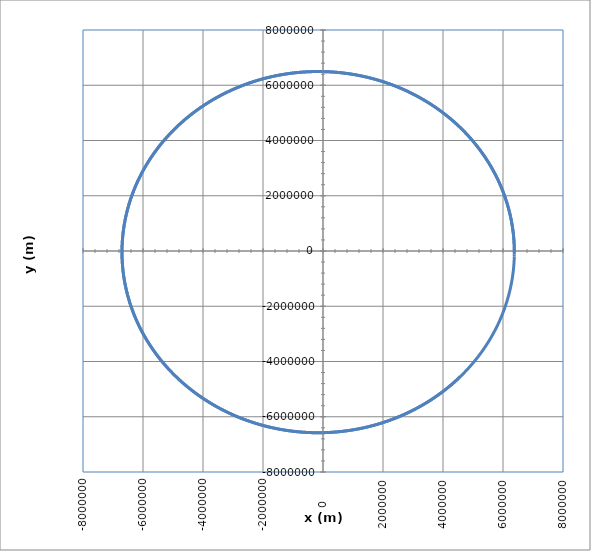
| Category | Series 0 |
|---|---|
| 6378000.0 | 0 |
| 6377020.689898966 | 80000 |
| 6375062.000099734 | 159987.714 |
| 6372124.0226277085 | 239950.851 |
| 6368207.011246662 | 319877.122 |
| 6363311.381537034 | 399754.236 |
| 6357437.710936596 | 479569.909 |
| 6350586.738743401 | 559311.859 |
| 6342759.366080954 | 638967.814 |
| 6333956.655825519 | 718525.515 |
| 6324179.832495554 | 797972.712 |
| 6313430.282103225 | 877297.173 |
| 6301709.551967995 | 956486.68 |
| 6289019.350492314 | 1035529.04 |
| 6275361.546899408 | 1114412.077 |
| 6260738.1709332345 | 1193123.643 |
| 6245151.41252065 | 1271651.615 |
| 6228603.621395869 | 1349983.899 |
| 6211097.306687311 | 1428108.433 |
| 6192635.136466936 | 1506013.189 |
| 6173219.937262207 | 1583686.173 |
| 6152854.693530814 | 1661115.432 |
| 6131542.547098321 | 1738289.052 |
| 6109286.796558916 | 1815195.159 |
| 6086090.896639446 | 1891821.929 |
| 6061958.45752696 | 1968157.582 |
| 6036893.244159976 | 2044190.388 |
| 6010899.175483707 | 2119908.669 |
| 5983980.323669521 | 2195300.799 |
| 5956140.913298884 | 2270355.21 |
| 5927385.320512096 | 2345060.392 |
| 5897718.072122102 | 2419404.894 |
| 5867143.844693707 | 2493377.329 |
| 5835667.463588539 | 2566966.372 |
| 5803293.90197607 | 2640160.768 |
| 5770028.279811107 | 2712949.329 |
| 5735875.862778079 | 2785320.937 |
| 5700842.061202551 | 2857264.547 |
| 5664932.428930338 | 2928769.191 |
| 5628152.662174647 | 2999823.975 |
| 5590508.598331685 | 3070418.086 |
| 5552006.214765155 | 3140540.791 |
| 5512651.627560107 | 3210181.44 |
| 5472451.090246614 | 3279329.467 |
| 5431410.992493735 | 3347974.392 |
| 5389537.858774267 | 3416105.826 |
| 5346838.347000788 | 3483713.469 |
| 5303319.247133486 | 3550787.112 |
| 5258987.479760316 | 3617316.641 |
| 5213850.094649998 | 3683292.038 |
| 5167914.269278402 | 3748703.381 |
| 5121187.307328886 | 3813540.85 |
| 5073676.637167109 | 3877794.723 |
| 5025389.810290927 | 3941455.382 |
| 4976334.499755917 | 4004513.312 |
| 4926518.498577127 | 4066959.107 |
| 4875949.718107632 | 4128783.464 |
| 4824636.186394505 | 4189977.191 |
| 4772586.046512788 | 4250531.208 |
| 4719807.554878091 | 4310436.545 |
| 4666309.07953842 | 4369684.345 |
| 4612099.098445855 | 4428265.869 |
| 4557186.197708716 | 4486172.49 |
| 4501579.069824819 | 4543395.702 |
| 4445286.511896488 | 4599927.117 |
| 4388317.423827927 | 4655758.467 |
| 4330680.806505612 | 4710881.606 |
| 4272385.759962345 | 4765288.511 |
| 4213441.481525593 | 4818971.282 |
| 4153857.263950793 | 4871922.146 |
| 4093642.4935402297 | 4924133.455 |
| 4032806.6482481724 | 4975597.69 |
| 3971359.295772895 | 5026307.459 |
| 3909310.0916362423 | 5076255.502 |
| 3846668.7772513814 | 5125434.686 |
| 3783445.1779794004 | 5173838.015 |
| 3719649.201175389 | 5221458.62 |
| 3655290.8342246576 | 5268289.77 |
| 3590380.142569737 | 5314324.867 |
| 3524927.2677287995 | 5359557.448 |
| 3458942.425306147 | 5403981.186 |
| 3392435.9029954006 | 5447589.892 |
| 3325418.0585760283 | 5490377.515 |
| 3257899.3179038437 | 5532338.141 |
| 3189890.1728961007 | 5573465.997 |
| 3121401.179511812 | 5613755.448 |
| 3052442.955727908 | 5653201.001 |
| 2983026.179511851 | 5691797.304 |
| 2913161.5867913202 | 5729539.145 |
| 2842859.96942156 | 5766421.455 |
| 2772132.173151005 | 5802439.31 |
| 2700989.0955857662 | 5837587.927 |
| 2629441.684153564 | 5871862.665 |
| 2557500.934067695 | 5905259.031 |
| 2485177.886291604 | 5937772.672 |
| 2412483.6255046246 | 5969399.384 |
| 2339429.2780694524 | 6000135.105 |
| 2266026.0100019025 | 6029975.919 |
| 2192285.0249434942 | 6058918.057 |
| 2118217.5621374035 | 6086957.892 |
| 2043834.8944083082 | 6114091.948 |
| 1969148.326146649 | 6140316.892 |
| 1894169.1912978187 | 6165629.536 |
| 1818908.8513567834 | 6190026.842 |
| 1743378.6933686293 | 6213505.916 |
| 1667590.1279355234 | 6236064.01 |
| 1591554.5872305636 | 6257698.523 |
| 1515283.5230189874 | 6278407.002 |
| 1438788.4046871967 | 6298187.137 |
| 1362080.7172800484 | 6317036.768 |
| 1285171.9595468515 | 6334953.877 |
| 1208073.641996498 | 6351936.596 |
| 1130797.2849621517 | 6367983.201 |
| 1053354.4166759017 | 6383092.112 |
| 975756.5713537835 | 6397261.897 |
| 898015.2872915571 | 6410491.268 |
| 820142.1049716235 | 6422779.082 |
| 742148.5651814499 | 6434124.34 |
| 664046.2071438631 | 6444526.189 |
| 585846.566659563 | 6453983.918 |
| 507561.17426219425 | 6462496.96 |
| 429201.5533863079 | 6470064.892 |
| 350779.2185485314 | 6476687.432 |
| 272305.6735422566 | 6482364.443 |
| 193792.40964614574 | 6487095.926 |
| 115250.90384674368 | 6490882.028 |
| 36692.61707547557 | 6493723.032 |
| -41871.00753970102 | 6495619.364 |
| -120428.5464077312 | 6496571.589 |
| -198968.59719273623 | 6496580.413 |
| -277479.78051688685 | 6495646.676 |
| -355950.7416476479 | 6493771.361 |
| -434370.15216917556 | 6490955.584 |
| -512726.71163765766 | 6487200.6 |
| -591009.1492203993 | 6482507.8 |
| -669206.2253184629 | 6476878.709 |
| -747306.733172684 | 6470314.987 |
| -825299.5004528912 | 6462818.428 |
| -903173.3908301715 | 6454390.959 |
| -980917.3055320269 | 6445034.638 |
| -1058520.1848802818 | 6434751.657 |
| -1135971.0098116074 | 6423544.335 |
| -1213258.8033805394 | 6411415.125 |
| -1290372.6322448726 | 6398366.605 |
| -1367301.6081333274 | 6384401.485 |
| -1444034.889295389 | 6369522.598 |
| -1520561.6819332307 | 6353732.907 |
| -1596871.2416156414 | 6337035.498 |
| -1672952.8746738818 | 6319433.584 |
| -1748795.9395794086 | 6300930.499 |
| -1824389.8483034074 | 6281529.702 |
| -1899724.0676580863 | 6261234.773 |
| -1974788.1206196903 | 6240049.411 |
| -2049571.5876332023 | 6217977.438 |
| -2124064.1078987056 | 6195022.792 |
| -2198255.380639388 | 6171189.531 |
| -2272135.166351177 | 6146481.829 |
| -2345693.2880340014 | 6120903.975 |
| -2418919.6324046827 | 6094460.373 |
| -2491804.151091463 | 6067155.544 |
| -2564336.861810187 | 6038994.116 |
| -2636507.849522158 | 6009980.834 |
| -2708307.2675737 | 5980120.549 |
| -2779725.338817453 | 5949418.226 |
| -2850752.356715451 | 5917878.936 |
| -2921378.6864240183 | 5885507.856 |
| -2991594.765860543 | 5852310.273 |
| -3061391.1067521814 | 5818291.575 |
| -3130758.2956665554 | 5783457.258 |
| -3199686.9950245107 | 5747812.918 |
| -3268167.944095006 | 5711364.254 |
| -3336191.959972214 | 5674117.066 |
| -3403749.938534908 | 5636077.252 |
| -3470832.8553882316 | 5597250.81 |
| -3537431.766787929 | 5557643.835 |
| -3603537.8105471395 | 5517262.518 |
| -3669142.206925849 | 5476113.145 |
| -3734236.2595031047 | 5434202.095 |
| -3798811.3560320963 | 5391535.84 |
| -3862858.9692782112 | 5348120.945 |
| -3926370.657840184 | 5303964.063 |
| -3989338.066954446 | 5259071.937 |
| -4051752.929282801 | 5213451.399 |
| -4113607.06568355 | 5167109.366 |
| -4174892.3859661804 | 5120052.843 |
| -4235600.88962976 | 5072288.916 |
| -4295724.666585158 | 5023824.758 |
| -4355255.897861221 | 4974667.621 |
| -4414186.856295056 | 4924824.839 |
| -4472509.907206532 | 4874303.826 |
| -4530217.509057162 | 4823112.075 |
| -4587302.214093492 | 4771257.154 |
| -4643756.668975144 | 4718746.71 |
| -4699573.615387652 | 4665588.462 |
| -4754745.890640251 | 4611790.205 |
| -4809266.428248741 | 4557359.805 |
| -4863128.258503592 | 4502305.201 |
| -4916324.509023441 | 4446634.4 |
| -4968848.405294114 | 4390355.48 |
| -5020693.271193335 | 4333476.584 |
| -5071852.529501274 | 4276005.925 |
| -5122319.702397084 | 4217951.779 |
| -5172088.41194157 | 4159322.486 |
| -5221152.380546165 | 4100126.45 |
| -5269505.431428335 | 4040372.136 |
| -5317141.4890536005 | 3980068.071 |
| -5364054.579564298 | 3919222.839 |
| -5410238.831195249 | 3857845.084 |
| -5455688.474676497 | 3795943.507 |
| -5500397.843623243 | 3733526.864 |
| -5544361.374913153 | 3670603.965 |
| -5587573.609051181 | 3607183.676 |
| -5630029.190522058 | 3543274.913 |
| -5671722.868130601 | 3478886.643 |
| -5712649.495329991 | 3414027.884 |
| -5752804.030538173 | 3348707.704 |
| -5792181.537442518 | 3282935.215 |
| -5830777.185292906 | 3216719.578 |
| -5868586.24918337 | 3150069.999 |
| -5905604.110322446 | 3082995.728 |
| -5941826.256292382 | 3015506.057 |
| -5977248.28129734 | 2947610.321 |
| -6011865.886400737 | 2879317.894 |
| -6045674.879751866 | 2810638.191 |
| -6078671.1768019395 | 2741580.666 |
| -6110850.800509688 | 2672154.807 |
| -6142209.881536653 | 2602370.141 |
| -6172744.658432309 | 2532236.229 |
| -6202451.477809145 | 2461762.665 |
| -6231326.794507852 | 2390959.077 |
| -6259367.171752716 | 2319835.122 |
| -6286569.281297379 | 2248400.49 |
| -6312929.903561067 | 2176664.898 |
| -6338445.927755425 | 2104638.094 |
| -6363114.35200208 | 2032329.85 |
| -6386932.283441042 | 1959749.966 |
| -6409896.938330071 | 1886908.263 |
| -6432005.642135129 | 1813814.592 |
| -6453255.829612016 | 1740478.819 |
| -6473645.044879315 | 1666910.838 |
| -6493170.941482761 | 1593120.56 |
| -6511831.282451117 | 1519117.914 |
| -6529623.940343695 | 1444912.851 |
| -6546546.897289591 | 1370515.335 |
| -6562598.245018769 | 1295935.348 |
| -6577776.184885062 | 1221182.886 |
| -6592079.027881204 | 1146267.961 |
| -6605505.194645981 | 1071200.594 |
| -6618053.215463596 | 995990.82 |
| -6629721.730255326 | 920648.684 |
| -6640509.488563569 | 845184.24 |
| -6650415.349528362 | 769607.551 |
| -6659438.281856442 | 693928.686 |
| -6667577.363782943 | 618157.722 |
| -6674831.783025795 | 542304.74 |
| -6681200.836732897 | 466379.826 |
| -6686683.931422147 | 390393.067 |
| -6691280.582914383 | 314354.555 |
| -6694990.416259309 | 238274.38 |
| -6697813.1656544665 | 162162.634 |
| -6699748.674357313 | 86029.406 |
| -6700796.8945904635 | 9884.785 |
| -6700957.887440153 | -66261.144 |
| -6700231.822747969 | -142398.302 |
| -6698618.978995902 | -218516.614 |
| -6696119.743184774 | -294606.01 |
| -6692734.610706069 | -370656.431 |
| -6688464.185207223 | -446657.821 |
| -6683309.17845041 | -522600.14 |
| -6677270.4101648545 | -598473.352 |
| -6670348.807892705 | -674267.438 |
| -6662545.40682851 | -749972.388 |
| -6653861.349652306 | -825578.206 |
| -6644297.886356369 | -901074.912 |
| -6633856.374065619 | -976452.54 |
| -6622538.276851736 | -1051701.142 |
| -6610345.165540966 | -1126810.785 |
| -6597278.717515669 | -1201771.559 |
| -6583340.716509589 | -1276573.568 |
| -6568533.052396882 | -1351206.942 |
| -6552857.7209748905 | -1425661.829 |
| -6536316.823740676 | -1499928.4 |
| -6518912.567661315 | -1573996.851 |
| -6500647.264937952 | -1647857.401 |
| -6481523.332763607 | -1721500.297 |
| -6461543.293074732 | -1794915.809 |
| -6440709.772296511 | -1868094.237 |
| -6419025.501081887 | -1941025.91 |
| -6396493.314044308 | -2013701.185 |
| -6373116.1494841715 | -2086110.449 |
| -6348897.0491089495 | -2158244.123 |
| -6323839.157746975 | -2230092.658 |
| -6297945.723054868 | -2301646.54 |
| -6271220.095218564 | -2372896.289 |
| -6243665.726647936 | -2443832.46 |
| -6215286.171664957 | -2514445.645 |
| -6186085.086185391 | -2584726.473 |
| -6156066.227393958 | -2654665.612 |
| -6125233.453412949 | -2724253.767 |
| -6093590.722964244 | -2793481.687 |
| -6061142.095024691 | -2862340.16 |
| -6027891.728474805 | -2930820.017 |
| -5993843.881740736 | -2998912.131 |
| -5959002.912429457 | -3066607.42 |
| -5923373.276957124 | -3133896.847 |
| -5886959.530170553 | -3200771.423 |
| -5849766.324961759 | -3267222.203 |
| -5811798.41187549 | -3333240.291 |
| -5773060.638709717 | -3398816.842 |
| -5733557.950109001 | -3463943.059 |
| -5693295.387150675 | -3528610.195 |
| -5652278.0869237855 | -3592809.558 |
| -5610511.282100715 | -3656532.506 |
| -5568000.300501423 | -3719770.453 |
| -5524750.564650235 | -3782514.866 |
| -5480767.591325098 | -3844757.269 |
| -5436056.991099238 | -3906489.241 |
| -5390624.467875143 | -3967702.422 |
| -5344475.818410779 | -4028388.506 |
| -5297616.931837986 | -4088539.251 |
| -5250053.789172942 | -4148146.472 |
| -5201792.4628186375 | -4207202.048 |
| -5152839.116059268 | -4265697.918 |
| -5103200.002546451 | -4323626.088 |
| -5052881.465777196 | -4380978.624 |
| -5001889.938563524 | -4437747.659 |
| -4950231.942493663 | -4493925.395 |
| -4897914.087384716 | -4549504.096 |
| -4844943.070726712 | -4604476.098 |
| -4791325.677117962 | -4658833.804 |
| -4737068.777691603 | -4712569.689 |
| -4682179.329533249 | -4765676.296 |
| -4626664.37508966 | -4818146.242 |
| -4570531.0415683165 | -4869972.217 |
| -4513786.540327812 | -4921146.982 |
| -4456438.166258965 | -4971663.377 |
| -4398493.297156554 | -5021514.314 |
| -4339959.39308157 | -5070692.782 |
| -4280843.995713893 | -5119191.849 |
| -4221154.727695291 | -5167004.66 |
| -4160899.2919626366 | -5214124.44 |
| -4100085.471071255 | -5260544.494 |
| -4038721.126508282 | -5306258.208 |
| -3976814.197995949 | -5351259.051 |
| -3914372.7027846854 | -5395540.572 |
| -3851404.734935938 | -5439096.408 |
| -3787918.4645946105 | -5481920.278 |
| -3723922.1372510195 | -5524005.987 |
| -3659424.0729922666 | -5565347.428 |
| -3594432.66574293 | -5605938.58 |
| -3528956.3824949716 | -5645773.511 |
| -3463003.762526765 | -5684846.379 |
| -3396583.416611144 | -5723151.43 |
| -3329704.0262123733 | -5760683.004 |
| -3262374.3426719485 | -5797435.531 |
| -3194603.186383125 | -5833403.534 |
| -3126399.4459540835 | -5868581.63 |
| -3057772.0773596396 | -5902964.532 |
| -2988730.1030814014 | -5936547.047 |
| -2919282.6112362887 | -5969324.077 |
| -2849438.754693319 | -6001290.624 |
| -2779207.7501785774 | -6032441.787 |
| -2708598.877368278 | -6062772.764 |
| -2637621.477969838 | -6092278.851 |
| -2566284.954790876 | -6120955.449 |
| -2494598.770796057 | -6148798.055 |
| -2422572.4481517025 | -6175802.272 |
| -2350215.567258092 | -6201963.806 |
| -2277537.765769376 | -6227278.465 |
| -2204548.737601033 | -6251742.163 |
| -2131258.2319248 | -6275350.92 |
| -2057676.0521510057 | -6298100.862 |
| -1983812.0548982448 | -6319988.221 |
| -1909676.1489503323 | -6341009.339 |
| -1835278.2942004767 | -6361160.666 |
| -1760628.5005826175 | -6380438.761 |
| -1685736.8269898747 | -6398840.294 |
| -1610613.3801800606 | -6416362.045 |
| -1535268.3136682082 | -6433000.908 |
| -1459711.8266060748 | -6448753.887 |
| -1383954.1626485798 | -6463618.102 |
| -1308005.6088071456 | -6477590.785 |
| -1231876.4942899065 | -6490669.283 |
| -1155577.1893287622 | -6502851.06 |
| -1079118.1039932524 | -6514133.696 |
| -1002509.6869912316 | -6524514.885 |
| -925762.4244563343 | -6533992.443 |
| -848886.8387222172 | -6542564.3 |
| -771893.4870835767 | -6550228.509 |
| -694792.9605439393 | -6556983.24 |
| -617595.8825502314 | -6562826.785 |
| -540312.907714138 | -6567757.554 |
| -462954.72052026493 | -6571774.081 |
| -385532.034021125 | -6574875.023 |
| -308055.588518975 | -6577059.157 |
| -230536.15023453336 | -6578325.385 |
| -152984.50996261614 | -6578672.732 |
| -75411.48171473418 | -6578100.35 |
| 2172.0986513005046 | -6576607.512 |
| 79755.37481470394 | -6574193.619 |
| 157327.47138792468 | -6570858.199 |
| 234877.49532565632 | -6566600.904 |
| 312394.53734658496 | -6561421.516 |
| 389867.6733677916 | -6555319.941 |
| 467285.9659517233 | -6548296.218 |
| 544638.4657656399 | -6540350.509 |
| 621914.2130534364 | -6531483.11 |
| 699102.2391197344 | -6521694.442 |
| 776191.5678261288 | -6510985.06 |
| 853171.2170994686 | -6499355.645 |
| 930030.2004520443 | -6486807.012 |
| 1006757.5285135456 | -6473340.104 |
| 1083342.210574648 | -6458955.999 |
| 1159773.2561420763 | -6443655.903 |
| 1236039.6765049885 | -6427441.156 |
| 1312130.4863125137 | -6410313.229 |
| 1388034.7051622723 | -6392273.726 |
| 1463741.359199695 | -6373324.384 |
| 1539239.4827279537 | -6353467.072 |
| 1614518.119828306 | -6332703.794 |
| 1689566.3259906496 | -6311036.685 |
| 1764373.1697540735 | -6288468.015 |
| 1838927.7343571829 | -6265000.187 |
| 1913219.1193979704 | -6240635.74 |
| 1987236.4425029962 | -6215377.343 |
| 2060968.8410056285 | -6189227.802 |
| 2134405.473633094 | -6162190.056 |
| 2207535.5222020736 | -6134267.179 |
| 2280348.193322568 | -6105462.378 |
| 2352832.7201097673 | -6075778.995 |
| 2424978.363903617 | -6045220.506 |
| 2496774.4159958037 | -6013790.521 |
| 2568210.199363841 | -5981492.784 |
| 2639275.070411952 | -5948331.173 |
| 2709958.4207184208 | -5914309.701 |
| 2780249.6787890843 | -5879432.512 |
| 2850138.3118166314 | -5843703.887 |
| 2919613.8274453515 | -5807128.238 |
| 2988665.775540989 | -5769710.11 |
| 3057283.7499653315 | -5731454.183 |
| 3125457.390355164 | -5692365.269 |
| 3193176.38390521 | -5652448.31 |
| 3260430.467154665 | -5611708.384 |
| 3327209.4277769346 | -5570150.697 |
| 3393503.1063721683 | -5527780.59 |
| 3459301.3982621753 | -5484603.533 |
| 3524594.2552873036 | -5440625.125 |
| 3589371.6876048585 | -5395851.1 |
| 3653623.765488616 | -5350287.316 |
| 3717340.621128998 | -5303939.764 |
| 3780512.4504334503 | -5256814.564 |
| 3843129.5148265706 | -5208917.961 |
| 3905182.1430495195 | -5160256.33 |
| 3966660.732958244 | -5110836.172 |
| 4027555.753320032 | -5060664.115 |
| 4087857.745607911 | -5009746.913 |
| 4147557.3257924095 | -4958091.443 |
| 4206645.186130162 | -4905704.709 |
| 4265112.096948877 | -4852593.835 |
| 4322948.908428133 | -4798766.072 |
| 4380146.552375512 | -4744228.789 |
| 4436696.043997519 | -4688989.479 |
| 4492588.483664784 | -4633055.753 |
| 4547815.058671005 | -4576435.344 |
| 4602367.044985088 | -4519136.101 |
| 4656235.808995949 | -4461165.991 |
| 4709412.809249435 | -4402533.098 |
| 4761889.598176795 | -4343245.622 |
| 4813657.8238141695 | -4283311.876 |
| 4864709.23151252 | -4222740.288 |
| 4915035.665637448 | -4161539.397 |
| 4964629.071258333 | -4099717.854 |
| 5013481.4958262155 | -4037284.419 |
| 5061585.090839877 | -3974247.964 |
| 5108932.113499508 | -3910617.463 |
| 5155514.928347424 | -3846402.002 |
| 5201326.008895226 | -3781610.769 |
| 5246357.939236848 | -3716253.057 |
| 5290603.415646895 | -3650338.261 |
| 5334055.248163707 | -3583875.878 |
| 5376706.362156553 | -3516875.503 |
| 5418549.799876394 | -3449346.831 |
| 5459578.721989615 | -3381299.654 |
| 5499786.409094163 | -3312743.859 |
| 5539166.263217505 | -3243689.426 |
| 5577711.809295829 | -3174146.43 |
| 5615416.69663392 | -3104125.034 |
| 5652274.700345127 | -3033635.493 |
| 5688279.722770862 | -2962688.147 |
| 5723425.794879058 | -2891293.425 |
| 5757707.077641023 | -2819461.839 |
| 5791117.863386127 | -2747203.984 |
| 5823652.577133769 | -2674530.536 |
| 5855305.777902074 | -2601452.25 |
| 5886072.159992763 | -2527979.959 |
| 5915946.554251664 | -2454124.574 |
| 5944923.929304324 | -2379897.075 |
| 5972999.392766185 | -2305308.52 |
| 6000168.192426813 | -2230370.034 |
| 6026425.717407644 | -2155092.81 |
| 6051767.499292755 | -2079488.11 |
| 6076189.21323214 | -2003567.259 |
| 6099686.679017008 | -1927341.647 |
| 6122255.862126608 | -1850822.721 |
| 6143892.8747461 | -1774021.99 |
| 6164593.976755011 | -1696951.019 |
| 6184355.5766858095 | -1619621.427 |
| 6203174.232652143 | -1542044.888 |
| 6221046.653246304 | -1464233.125 |
| 6237969.698405492 | -1386197.909 |
| 6253940.3802464465 | -1307951.06 |
| 6268955.8638680475 | -1229504.441 |
| 6283013.468121482 | -1150869.956 |
| 6296110.666347589 | -1072059.552 |
| 6308245.087081014 | -993085.213 |
| 6319414.5147208 | -913958.959 |
| 6329616.89016708 | -834692.842 |
| 6338850.31142352 | -755298.949 |
| 6347113.034165198 | -675789.393 |
| 6354403.472271606 | -596176.315 |
| 6360720.198324478 | -516471.884 |
| 6366061.944070158 | -436688.287 |
| 6370427.600846248 | -356837.733 |
| 6373816.21997228 | -276932.451 |
| 6376227.01310416 | -196984.684 |
| 6377659.352552183 | -117006.69 |
| 6378112.771562386 | -37010.735 |
| 6377586.964561065 | 42990.901 |
| 6376081.787362261 | 122985.936 |
| 6373597.257338068 | 202962.081 |
| 6370133.553551606 | 282907.044 |
| 6365691.016852525 | 362808.536 |
| 6360270.149934943 | 442654.269 |
| 6353871.617357696 | 522431.959 |
| 6346496.245526844 | 602129.331 |
| 6338145.022640335 | 681734.118 |
| 6328819.09859482 | 761234.066 |
| 6318519.7848545415 | 840616.934 |
| 6307248.554282319 | 919870.498 |
| 6295007.040932606 | 998982.553 |
| 6281797.039806653 | 1077940.914 |
| 6267620.506569799 | 1156733.421 |
| 6252479.557230957 | 1235347.938 |
| 6236376.467784346 | 1313772.358 |
| 6219313.673813569 | 1391994.603 |
| 6201293.770058132 | 1470002.631 |
| 6182319.50994252 | 1547784.43 |
| 6162393.80506798 | 1625328.029 |
| 6141519.724667137 | 1702621.494 |
| 6119700.495021642 | 1779652.935 |
| 6096939.498843018 | 1856410.503 |
| 6073240.274616902 | 1932882.397 |
| 6048606.515910917 | 2009056.864 |
| 6023042.070646394 | 2084922.201 |
| 5996550.940334201 | 2160466.76 |
| 5969137.279274933 | 2235678.945 |
| 5940805.393723763 | 2310547.218 |
| 5911559.741020225 | 2385060.101 |
| 5881404.928683264 | 2459206.177 |
| 5850345.71347186 | 2532974.094 |
| 5818387.000411575 | 2606352.562 |
| 5785533.841787385 | 2679330.362 |
| 5751791.436103147 | 2751896.345 |
| 5717165.127008106 | 2824039.431 |
| 5681660.402190816 | 2895748.617 |
| 5645282.892240914 | 2967012.974 |
| 5608038.3694791375 | 3037821.652 |
| 5569932.746756047 | 3108163.88 |
| 5530972.076219889 | 3178028.97 |
| 5491162.548054068 | 3247406.317 |
| 5450510.489184689 | 3316285.401 |
| 5409022.361958665 | 3384655.791 |
| 5366704.762792886 | 3452507.145 |
| 5323564.4207949415 | 3519829.213 |
| 5279608.196355925 | 3586611.836 |
| 5234843.079715848 | 3652844.952 |
| 5189276.189502191 | 3718518.595 |
| 5142914.77124214 | 3783622.897 |
| 5095766.195849073 | 3848148.091 |
| 5047837.958083841 | 3912084.51 |
| 4999137.674991431 | 3975422.592 |
| 4949673.084313581 | 4038152.881 |
| 4899452.04287794 | 4100266.025 |
| 4848482.524964361 | 4161752.782 |
| 4796772.620648924 | 4222604.019 |
| 4744330.534126308 | 4282810.716 |
| 4691164.582011108 | 4342363.964 |
| 4637283.191618731 | 4401254.968 |
| 4582694.899226475 | 4459475.05 |
| 4527408.348315431 | 4517015.648 |
| 4471432.2877938375 | 4573868.319 |
| 4414775.570202516 | 4630024.74 |
| 4357447.149903028 | 4685476.709 |
| 4299456.081249199 | 4740216.144 |
| 4240811.516742644 | 4794235.091 |
| 4181522.705172949 | 4847525.717 |
| 4121598.9897431475 | 4900080.315 |
| 4061049.806181146 | 4951891.309 |
| 3999884.6808377425 | 5002951.246 |
| 3938113.228771895 | 5053252.805 |
| 3875745.1518238788 | 5102788.796 |
| 3812790.2366769924 | 5151552.158 |
| 3749258.3529084544 | 5199535.964 |
| 3685159.451030141 | 5246733.42 |
| 3620503.5605198103 | 5293137.864 |
| 3555300.787843454 | 5338742.773 |
| 3489561.3144694273 | 5383541.757 |
| 3423295.3948749844 | 5427528.562 |
| 3356513.354545867 | 5470697.074 |
| 3289225.587969574 | 5513041.316 |
| 3221442.55662294 | 5554555.449 |
| 3153174.786954655 | 5595233.774 |
| 3084432.8683633404 | 5635070.733 |
| 3015227.4511718033 | 5674060.909 |
| 2945569.2445980767 | 5712199.024 |
| 2875469.0147238574 | 5749479.946 |
| 2804937.582460939 | 5785898.681 |
| 2733985.8215162386 | 5821450.381 |
| 2662624.6563560055 | 5856130.341 |
| 2590865.0601697946 | 5889933.998 |
| 2518718.0528347865 | 5922856.936 |
| 2446194.6988810156 | 5954894.88 |
| 2373306.1054580784 | 5986043.704 |
| 2300063.420303871 | 6016299.425 |
| 2226477.829715908 | 6045658.204 |
| 2152560.556525763 | 6074116.35 |
| 2078322.858077161 | 6101670.316 |
| 2003776.0242082484 | 6128316.704 |
| 1928931.375238559 | 6154052.259 |
| 1853800.2599611806 | 6178873.873 |
| 1778394.053640623 | 6202778.585 |
| 1702724.1560168767 | 6225763.581 |
| 1626801.9893161438 | 6247826.191 |
| 1550638.9962687148 | 6268963.894 |
| 1474246.6381344504 | 6289174.314 |
| 1397636.3927363262 | 6308455.221 |
| 1320819.7525024817 | 6326804.532 |
| 1243808.2225172073 | 6344220.31 |
| 1166613.318581297 | 6360700.762 |
| 1089246.565282179 | 6376244.245 |
| 1011719.4940742303 | 6390849.256 |
| 934043.6413696699 | 6404514.441 |
| 856230.5466404173 | 6417238.591 |
| 778291.7505312887 | 6429020.64 |
| 700238.7929848984 | 6439859.666 |
| 622083.2113786191 | 6449754.894 |
| 543836.5386739449 | 6458705.69 |
| 465510.3015785939 | 6466711.564 |
| 387116.018721672 | 6473772.169 |
| 308665.19884221366 | 6479887.301 |
| 230169.3389914033 | 6485056.898 |
| 151639.92274877036 | 6489281.038 |
| 73088.41845264233 | 6492559.941 |
| -5473.722554871492 | 6494893.969 |
| -84035.06766810188 | 6496283.621 |
| -162584.2047429942 | 6496729.538 |
| -241109.74380699228 | 6496232.498 |
| -319600.31875339884 | 6494793.417 |
| -398044.5890199889 | 6492413.351 |
| -476431.2412516627 | 6489093.491 |
| -554748.9909469355 | 6484835.164 |
| -632986.5840880689 | 6479639.832 |
| -711132.7987546615 | 6473509.094 |
| -789176.4467205218 | 6466444.682 |
| -867106.375033661 | 6458448.461 |
| -944911.4675792477 | 6449522.428 |
| -1022580.6466253786 | 6439668.714 |
| -1100102.8743515294 | 6428889.578 |
| -1177467.1543595546 | 6417187.412 |
| -1254662.5331671203 | 6404564.736 |
| -1331678.1016834565 | 6391024.198 |
| -1408502.9966673302 | 6376568.575 |
| -1485126.4021671426 | 6361200.769 |
| -1561537.5509430699 | 6344923.81 |
| -1637725.7258711662 | 6327740.851 |
| -1713680.2613293668 | 6309655.172 |
| -1789390.5445653244 | 6290670.171 |
| -1864846.0170460332 | 6270789.375 |
| -1940036.1757891907 | 6250016.425 |
| -2014950.5746762648 | 6228355.089 |
| -2089578.825747234 | 6205809.249 |
| -2163910.60047698 | 6182382.909 |
| -2237935.631033319 | 6158080.188 |
| -2311643.711516661 | 6132905.321 |
| -2385024.6991813006 | 6106862.662 |
| -2458068.515638341 | 6079956.674 |
| -2530765.148040267 | 6052191.938 |
| -2603104.6502471846 | 6023573.143 |
| -2675077.143974752 | 5994105.093 |
| -2746672.8199238363 | 5963792.698 |
| -2817881.938891926 | 5932640.98 |
| -2888694.832866354 | 5900655.068 |
| -2959101.9060993684 | 5867840.198 |
| -3029093.6361651127 | 5834201.71 |
| -3098660.574998571 | 5799745.051 |
| -3167793.3499165466 | 5764475.77 |
| -3236482.6646207403 | 5728399.519 |
| -3304719.300183004 | 5691522.05 |
| -3372494.1160128503 | 5653849.216 |
| -3439798.050807303 | 5615386.969 |
| -3506622.123483168 | 5576141.359 |
| -3572957.4340918325 | 5536118.532 |
| -3638795.1647166735 | 5495324.729 |
| -3704126.580353185 | 5453766.288 |
| -3768943.0297719254 | 5411449.636 |
| -3833235.946364395 | 5368381.296 |
| -3896996.8489719485 | 5324567.88 |
| -3960217.342697867 | 5280016.089 |
| -4022889.119702698 | 5234732.713 |
| -4085003.9599829866 | 5188724.631 |
| -4146553.7321335264 | 5141998.806 |
| -4207530.39409325 | 5094562.286 |
| -4267925.99387489 | 5046422.205 |
| -4327732.670278543 | 4997585.777 |
| -4386942.653589267 | 4948060.299 |
| -4445548.266258858 | 4897853.147 |
| -4503541.923571922 | 4846971.778 |
| -4560916.134296407 | 4795423.725 |
| -4617663.501318721 | 4743216.597 |
| -4673776.722263583 | 4690358.081 |
| -4729248.59009875 | 4636855.937 |
| -4784071.99372477 | 4582717.997 |
| -4838239.9185499055 | 4527952.167 |
| -4891745.44705037 | 4472566.421 |
| -4944581.75931604 | 4416568.805 |
| -4996742.133581781 | 4359967.432 |
| -5048219.946744539 | 4302770.481 |
| -5099008.674866361 | 4244986.2 |
| -5149101.893663478 | 4186622.899 |
| -5198493.278981622 | 4127688.953 |
| -5247176.607257715 | 4068192.798 |
| -5295145.755968087 | 4008142.931 |
| -5342394.704063387 | 3947547.911 |
| -5388917.532390318 | 3886416.354 |
| -5434708.4241003785 | 3824756.934 |
| -5479761.665045734 | 3762578.381 |
| -5524071.644162386 | 3699889.482 |
| -5567632.853840799 | 3636699.074 |
| -5610439.890284117 | 3573016.051 |
| -5652487.453854137 | 3508849.357 |
| -5693770.34940518 | 3444207.986 |
| -5734283.486606021 | 3379100.982 |
| -5774021.880250016 | 3313537.437 |
| -5812980.650553578 | 3247526.489 |
| -5851155.023443149 | 3181077.324 |
| -5888540.3308308255 | 3114199.17 |
| -5925132.010878754 | 3046901.3 |
| -5960925.608252477 | 2979193.029 |
| -5995916.774363345 | 2911083.714 |
| -6030101.267600147 | 2842582.75 |
| -6063474.9535501 | 2773699.573 |
| -6096033.805209332 | 2704443.654 |
| -6127773.903182998 | 2634824.504 |
| -6158691.435875169 | 2564851.666 |
| -6188782.699668616 | 2494534.721 |
| -6218044.099094637 | 2423883.278 |
| -6246472.146993044 | 2352906.984 |
| -6274063.464662447 | 2281615.511 |
| -6300814.782000957 | 2210018.566 |
| -6326722.937637441 | 2138125.881 |
| -6351784.879053441 | 2065947.216 |
| -6375997.662695887 | 1993492.358 |
| -6399358.454080719 | 1920771.121 |
| -6421864.527887537 | 1847793.339 |
| -6443513.268045397 | 1774568.873 |
| -6464302.1678098515 | 1701107.604 |
| -6484228.829831371 | 1627419.432 |
| -6503290.96621523 | 1553514.282 |
| -6521486.398572973 | 1479402.092 |
| -6538813.058065576 | 1405092.82 |
| -6555268.98543838 | 1330596.441 |
| -6570852.331047926 | 1255922.945 |
| -6585561.354880758 | 1181082.334 |
| -6599394.426564314 | 1106084.627 |
| -6612350.025369985 | 1030939.852 |
| -6624426.7402084265 | 955658.049 |
| -6635623.269617227 | 880249.267 |
| -6645938.421741 | 804723.567 |
| -6655371.114303994 | 729091.014 |
| -6663920.374575292 | 653361.682 |
| -6671585.339326685 | 577545.649 |
| -6678365.254783292 | 501652.999 |
| -6684259.476566992 | 425693.819 |
| -6689267.469632744 | 349678.199 |
| -6693388.808197865 | 273616.23 |
| -6696623.1756643215 | 197518.002 |
| -6698970.364534098 | 121393.607 |
| -6700430.27631771 | 45253.134 |
| -6701002.9214359075 | -30893.332 |
| -6700688.419114624 | -107035.708 |
| -6699486.997273232 | -183163.917 |
| -6697398.992406135 | -259267.886 |
| -6694424.849457765 | -335337.551 |
| -6690565.121691003 | -411362.856 |
| -6685820.470549086 | -487333.752 |
| -6680191.665511021 | -563240.201 |
| -6673679.58394055 | -639072.177 |
| -6666285.210928694 | -714819.665 |
| -6658009.6391299125 | -790472.662 |
| -6648854.06859189 | -866021.182 |
| -6638819.806578993 | -941455.251 |
| -6627908.2673894055 | -1016764.913 |
| -6616120.972165967 | -1091940.228 |
| -6603459.5487007275 | -1166971.275 |
| -6589925.731233233 | -1241848.151 |
| -6575521.360242553 | -1316560.974 |
| -6560248.382233062 | -1391099.884 |
| -6544108.849513971 | -1465455.041 |
| -6527104.919972624 | -1539616.629 |
| -6509238.856841545 | -1613574.857 |
| -6490513.02845925 | -1687319.958 |
| -6470929.90802481 | -1760842.19 |
| -6450492.073346155 | -1834131.842 |
| -6429202.20658211 | -1907179.227 |
| -6407063.0939781675 | -1979974.689 |
| -6384077.625595948 | -2052508.601 |
| -6360248.795036365 | -2124771.369 |
| -6335579.699156455 | -2196753.43 |
| -6310073.537779849 | -2268445.252 |
| -6283733.613400877 | -2339837.339 |
| -6256563.33088226 | -2410920.232 |
| -6228566.197146365 | -2481684.503 |
| -6199745.820860007 | -2552120.764 |
| -6170105.912112728 | -2622219.666 |
| -6139650.282088558 | -2691971.896 |
| -6108382.842731186 | -2761368.183 |
| -6076307.606402517 | -2830399.296 |
| -6043428.685534564 | -2899056.045 |
| -6009750.292274633 | -2967329.283 |
| -5975276.738123754 | -3035209.91 |
| -5940012.433568295 | -3102688.865 |
| -5903961.88770473 | -3169757.138 |
| -5867129.70785748 | -3236405.762 |
| -5829520.599189795 | -3302625.819 |
| -5791139.364307594 | -3368408.439 |
| -5751990.902856226 | -3433744.804 |
| -5712080.211110072 | -3498626.142 |
| -5671412.381554929 | -3563043.737 |
| -5629992.60246311 | -3626988.923 |
| -5587826.157461199 | -3690453.086 |
| -5544918.425090368 | -3753427.67 |
| -5501274.878359213 | -3815904.171 |
| -5456901.084289013 | -3877874.144 |
| -5411802.703451352 | -3939329.199 |
| -5365985.489498009 | -4000261.005 |
| -5319455.288683058 | -4060661.289 |
| -5272218.039377083 | -4120521.842 |
| -5224279.771573434 | -4179834.51 |
| -5175646.606386429 | -4238591.206 |
| -5126324.755541436 | -4296783.903 |
| -5076320.520856734 | -4354404.64 |
| -5025640.293717069 | -4411445.519 |
| -4974290.554538818 | -4467898.708 |
| -4922277.872226676 | -4523756.443 |
| -4869608.903621758 | -4579011.027 |
| -4816290.392941051 | -4633654.83 |
| -4762329.171208091 | -4687680.294 |
| -4707732.1556748 | -4741079.931 |
| -4652506.349234369 | -4793846.322 |
| -4596658.839825096 | -4845972.124 |
| -4540196.799825089 | -4897450.064 |
| -4483127.485437726 | -4948272.945 |
| -4425458.2360677775 | -4998433.645 |
| -4367196.473688103 | -5047925.118 |
| -4308349.702196804 | -5096740.395 |
| -4248925.506764744 | -5144872.584 |
| -4188931.553173344 | -5192314.873 |
| -4128375.5871425313 | -5239060.53 |
| -4067265.433648763 | -5285102.903 |
| -4005608.99623301 | -5330435.421 |
| -3943414.256298603 | -5375051.596 |
| -3880689.2723988458 | -5418945.026 |
| -3817442.179514287 | -5462109.389 |
| -3753681.188319555 | -5504538.451 |
| -3689414.5844396525 | -5546226.064 |
| -3624650.727695614 | -5587166.166 |
| -3559398.0513394233 | -5627352.784 |
| -3493665.061278093 | -5666780.033 |
| -3427460.335286811 | -5705442.12 |
| -3360792.522211047 | -5743333.339 |
| -3293670.3411575346 | -5780448.079 |
| -3226102.580674022 | -5816780.819 |
| -3158098.0979177007 | -5852326.133 |
| -3089665.8178122183 | -5887078.688 |
| -3020814.7321931827 | -5921033.248 |
| -2951553.8989420617 | -5954184.67 |
| -2881892.441108394 | -5986527.909 |
| -2811839.5460202172 | -6018058.02 |
| -2741404.4643826303 | -6048770.154 |
| -2670596.509364398 | -6078659.561 |
| -2599425.0556725226 | -6107721.594 |
| -2527899.5386146912 | -6135951.704 |
| -2456029.4531495254 | -6163345.445 |
| -2383824.3529245527 | -6189898.476 |
| -2311293.8493018253 | -6215606.555 |
| -2238447.6103711077 | -6240465.549 |
| -2165295.359950572 | -6264471.428 |
| -2091846.8765749207 | -6287620.267 |
| -2018111.992470882 | -6309908.25 |
| -1944100.5925200044 | -6331331.668 |
| -1869822.613208701 | -6351886.92 |
| -1795288.041565476 | -6371570.514 |
| -1720506.9140852878 | -6390379.069 |
| -1645489.3156409927 | -6408309.313 |
| -1570245.3783818234 | -6425358.088 |
| -1494785.2806188602 | -6441522.345 |
| -1419119.2456974501 | -6456799.151 |
| -1343257.5408565437 | -6471185.686 |
| -1267210.4760749103 | -6484679.244 |
| -1190988.4029042071 | -6497277.233 |
| -1114601.7132888776 | -6508977.18 |
| -1038060.8383728556 | -6519776.725 |
| -961376.2472930627 | -6529673.629 |
| -884558.4459596857 | -6538665.767 |
| -807617.9758232263 | -6546751.137 |
| -730565.412628323 | -6553927.852 |
| -653411.3651543462 | -6560194.148 |
| -576166.4739427748 | -6565548.381 |
| -498841.4100113665 | -6569989.028 |
| -421446.8735551404 | -6573514.687 |
| -343993.5926341949 | -6576124.079 |
| -266492.32184838917 | -6577816.05 |
| -188953.84099892376 | -6578589.566 |
| -111388.95373685891 | -6578443.721 |
| -33808.48619861773 | -6577377.731 |
| 43776.71437147472 | -6575390.938 |
| 121355.78101155807 | -6572482.811 |
| 198917.828445445 | -6568652.944 |
| 276451.95449860103 | -6563901.059 |
| 353947.24152681895 | -6558227.005 |
| 431392.75785750395 | -6551630.758 |
| 508777.5592434802 | -6544112.424 |
| 586090.690329222 | -6535672.236 |
| 663321.1861294052 | -6526310.557 |
| 740458.073519669 | -6516027.88 |
| 817490.3727394707 | -6504824.827 |
| 894407.0989069073 | -6492702.152 |
| 971197.2635453738 | -6479660.739 |
| 1047849.8761219172 | -6465701.602 |
| 1124353.9455971397 | -6450825.887 |
| 1200698.4819864978 | -6435034.874 |
| 1276872.4979328332 | -6418329.971 |
| 1352865.0102899678 | -6400712.723 |
| 1428665.0417171842 | -6382184.803 |
| 1504261.6222844073 | -6362748.02 |
| 1579643.7910878905 | -6342404.315 |
| 1654800.5978762114 | -6321155.762 |
| 1729721.1046863608 | -6299004.57 |
| 1804394.387489712 | -6275953.079 |
| 1878809.537847644 | -6252003.765 |
| 1952955.664576582 | -6227159.236 |
| 2026821.895422218 | -6201422.237 |
| 2100397.3787426553 | -6174795.644 |
| 2173671.2852002243 | -6147282.469 |
| 2246632.809461695 | -6118885.856 |
| 2319271.171906619 | -6089609.087 |
| 2391575.620343508 | -6059455.574 |
| 2463535.4317335673 | -6028428.865 |
| 2535139.913921669 | -5996532.643 |
| 2606378.4073742717 | -5963770.724 |
| 2677240.2869239543 | -5930147.058 |
| 2747714.963520249 | -5895665.729 |
| 2817791.8859864296 | -5860330.954 |
| 2887460.542781921 | -5824147.084 |
| 2956710.4637699695 | -5787118.604 |
| 3025531.2219902207 | -5749250.132 |
| 3093912.4354358334 | -5710546.416 |
| 3161843.7688347567 | -5671012.341 |
| 3229314.9354347787 | -5630652.92 |
| 3296315.6987919644 | -5589473.302 |
| 3362835.874562072 | -5547478.765 |
| 3428865.332294545 | -5504674.717 |
| 3494393.9972286616 | -5461066.701 |
| 3559411.8520914163 | -5416660.387 |
| 3623908.9388967045 | -5371461.576 |
| 3687875.360745365 | -5325476.198 |
| 3751301.2836256386 | -5278710.312 |
| 3814176.938213586 | -5231170.106 |
| 3876492.621672999 | -5182861.897 |
| 3938238.699454347 | -5133792.125 |
| 3999405.6070922697 | -5083967.362 |
| 4059983.8520011413 | -5033394.302 |
| 4119964.0152682187 | -4982079.766 |
| 4179336.7534438684 | -4930030.699 |
| 4238092.8003283795 | -4877254.171 |
| 4296222.968754852 | -4823757.373 |
| 4353718.152367642 | -4769547.62 |
| 4410569.32739585 | -4714632.349 |
| 4466767.554421321 | -4659019.116 |
| 4522303.980140634 | -4602715.597 |
| 4577169.839120538 | -4545729.588 |